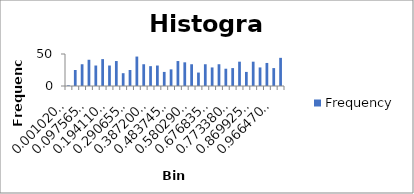
| Category | Frequency |
|---|---|
| 0.00102076 | 1 |
| 0.033202422 | 25 |
| 0.065384083 | 34 |
| 0.097565745 | 41 |
| 0.129747406 | 32 |
| 0.161929068 | 42 |
| 0.19411073 | 32 |
| 0.226292391 | 39 |
| 0.258474053 | 20 |
| 0.290655714 | 25 |
| 0.322837376 | 46 |
| 0.355019037 | 34 |
| 0.387200699 | 31 |
| 0.419382361 | 32 |
| 0.451564022 | 22 |
| 0.483745684 | 26 |
| 0.515927345 | 39 |
| 0.548109007 | 37 |
| 0.580290669 | 34 |
| 0.61247233 | 21 |
| 0.644653992 | 34 |
| 0.676835653 | 29 |
| 0.709017315 | 34 |
| 0.741198977 | 27 |
| 0.773380638 | 28 |
| 0.8055623 | 38 |
| 0.837743961 | 22 |
| 0.869925623 | 38 |
| 0.902107284 | 29 |
| 0.934288946 | 36 |
| 0.966470608 | 28 |
| More | 44 |